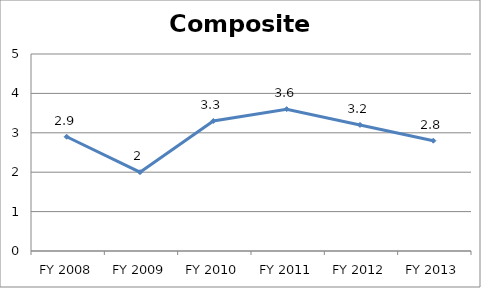
| Category | Composite score |
|---|---|
| FY 2013 | 2.8 |
| FY 2012 | 3.2 |
| FY 2011 | 3.6 |
| FY 2010 | 3.3 |
| FY 2009 | 2 |
| FY 2008 | 2.9 |